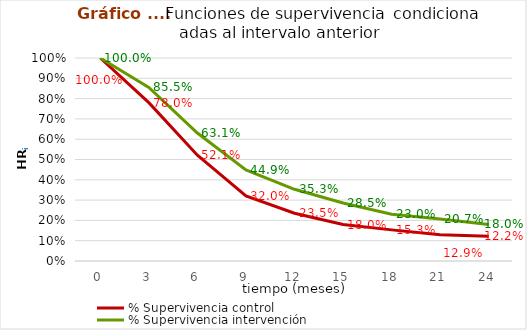
| Category | % Supervivencia control | % Supervivencia intervención |
|---|---|---|
| 0.0 | 1 | 1 |
| 3.0 | 0.78 | 0.855 |
| 6.0 | 0.521 | 0.631 |
| 9.0 | 0.32 | 0.449 |
| 12.0 | 0.235 | 0.353 |
| 15.0 | 0.18 | 0.285 |
| 18.0 | 0.153 | 0.23 |
| 21.0 | 0.129 | 0.207 |
| 24.0 | 0.122 | 0.18 |